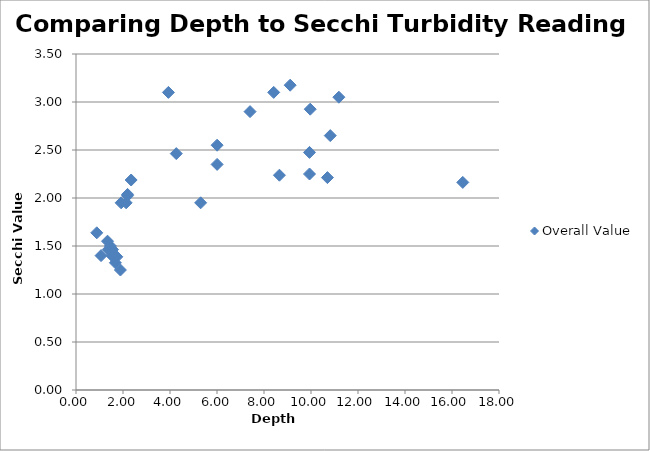
| Category | Overall Value |
|---|---|
| 1.88976 | 1.25 |
| 1.6764000000000001 | 1.325 |
| 1.7373600000000002 | 1.388 |
| 1.524 | 1.4 |
| 1.0668 | 1.4 |
| 1.3716000000000002 | 1.462 |
| 1.5544799999999999 | 1.462 |
| 1.4630400000000001 | 1.5 |
| 1.34112 | 1.55 |
| 0.88392 | 1.638 |
| 5.30352 | 1.95 |
| 1.92024 | 1.95 |
| 2.1336 | 1.95 |
| 2.19456 | 2.025 |
| 2.19456 | 2.038 |
| 16.4592 | 2.162 |
| 2.34696 | 2.188 |
| 10.698480000000002 | 2.212 |
| 8.65632 | 2.238 |
| 9.936480000000001 | 2.25 |
| 6.00456 | 2.35 |
| 4.2672 | 2.463 |
| 9.936480000000001 | 2.475 |
| 6.00456 | 2.55 |
| 10.820400000000001 | 2.65 |
| 7.40664 | 2.9 |
| 9.966960000000002 | 2.925 |
| 11.186160000000001 | 3.05 |
| 3.9319200000000003 | 3.1 |
| 8.41248 | 3.1 |
| 9.11352 | 3.175 |